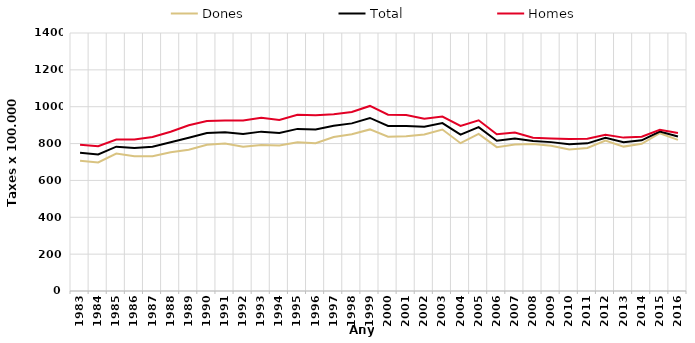
| Category | Dones | Total | Homes |
|---|---|---|---|
| 1983.0 | 707.02 | 749.77 | 794.25 |
| 1984.0 | 697.95 | 740.89 | 785.59 |
| 1985.0 | 746.1 | 783.12 | 821.68 |
| 1986.0 | 731.72 | 776.2 | 822.54 |
| 1987.0 | 731.62 | 782.36 | 835.26 |
| 1988.0 | 752.67 | 807.31 | 864.3 |
| 1989.0 | 767 | 831.72 | 899.28 |
| 1990.0 | 793.84 | 856.76 | 922.48 |
| 1991.0 | 800.54 | 861.29 | 924.79 |
| 1992.0 | 782.73 | 852.62 | 925.67 |
| 1993.0 | 792.68 | 864.8 | 940.2 |
| 1994.0 | 790.15 | 857.3 | 927.58 |
| 1995.0 | 806.8 | 879.62 | 955.83 |
| 1996.0 | 802.24 | 876.22 | 953.84 |
| 1997.0 | 835.76 | 896.25 | 959.74 |
| 1998.0 | 850.71 | 909.49 | 971.2 |
| 1999.0 | 876.82 | 939 | 1004.18 |
| 2000.0 | 837.69 | 895.65 | 956.35 |
| 2001.0 | 839.21 | 895.91 | 955.16 |
| 2002.0 | 849.41 | 891.03 | 934.19 |
| 2003.0 | 876.36 | 911 | 946.75 |
| 2004.0 | 802.09 | 848.17 | 895.55 |
| 2005.0 | 852.68 | 888.99 | 926.17 |
| 2006.0 | 780.47 | 815.18 | 850.62 |
| 2007.0 | 795.53 | 827.41 | 859.9 |
| 2008.0 | 797.85 | 814.39 | 831.21 |
| 2009.0 | 787.97 | 807.86 | 828.12 |
| 2010.0 | 768.51 | 796.23 | 824.53 |
| 2011.0 | 776.4 | 801.26 | 826.74 |
| 2012.0 | 816.69 | 831.948 | 847.618 |
| 2013.0 | 783.5 | 807.5 | 832.3 |
| 2014.0 | 798.5 | 817.44 | 837.08 |
| 2015.0 | 856.245 | 865.131 | 874.362 |
| 2016.0 | 819.946 | 838.418 | 857.629 |